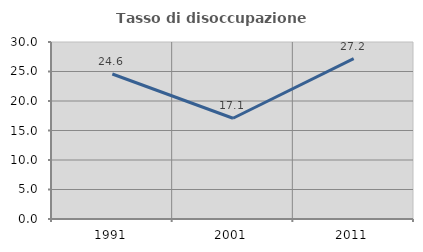
| Category | Tasso di disoccupazione giovanile  |
|---|---|
| 1991.0 | 24.581 |
| 2001.0 | 17.073 |
| 2011.0 | 27.174 |